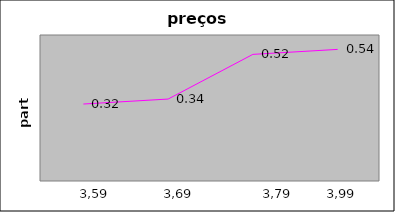
| Category | Series 1 |
|---|---|
| 0 | 0.316 |
| 1 | 0.337 |
| 2 | 0.52 |
| 3 | 0.541 |